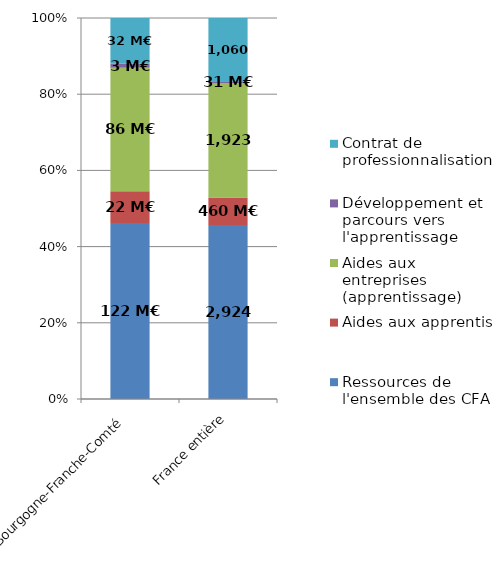
| Category | Ressources de l'ensemble des CFA | Aides aux apprentis | Aides aux entreprises (apprentissage) | Développement et parcours vers l'apprentissage | Contrat de professionnalisation |
|---|---|---|---|---|---|
| Bourgogne-Franche-Comté | 122.223 | 22.07 | 85.953 | 2.84 | 31.652 |
| France entière | 2924.219 | 459.796 | 1923.184 | 31.421 | 1060.48 |